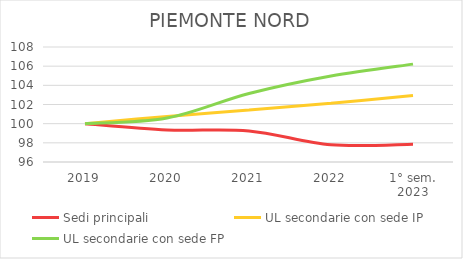
| Category | Sedi principali | UL secondarie con sede IP | UL secondarie con sede FP |
|---|---|---|---|
| 2019 | 100 | 100 | 100 |
| 2020 | 99.341 | 100.755 | 100.589 |
| 2021 | 99.245 | 101.414 | 103.151 |
| 2022 | 97.795 | 102.137 | 104.976 |
| 1° sem.
2023 | 97.855 | 102.94 | 106.213 |